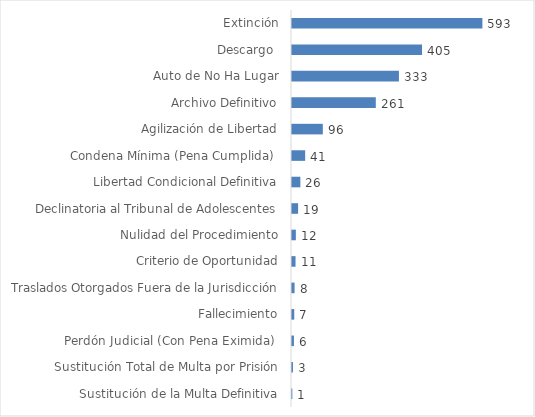
| Category | Series 0 |
|---|---|
| Sustitución de la Multa Definitiva | 0.001 |
| Sustitución Total de Multa por Prisión | 0.002 |
| Perdón Judicial (Con Pena Eximida)  | 0.003 |
| Fallecimiento | 0.004 |
| Traslados Otorgados Fuera de la Jurisdicción | 0.004 |
| Criterio de Oportunidad | 0.006 |
| Nulidad del Procedimiento | 0.007 |
| Declinatoria al Tribunal de Adolescentes | 0.01 |
| Libertad Condicional Definitiva | 0.014 |
| Condena Mínima (Pena Cumplida)  | 0.023 |
| Agilización de Libertad | 0.053 |
| Archivo Definitivo | 0.143 |
| Auto de No Ha Lugar | 0.183 |
| Descargo  | 0.222 |
| Extinción | 0.325 |